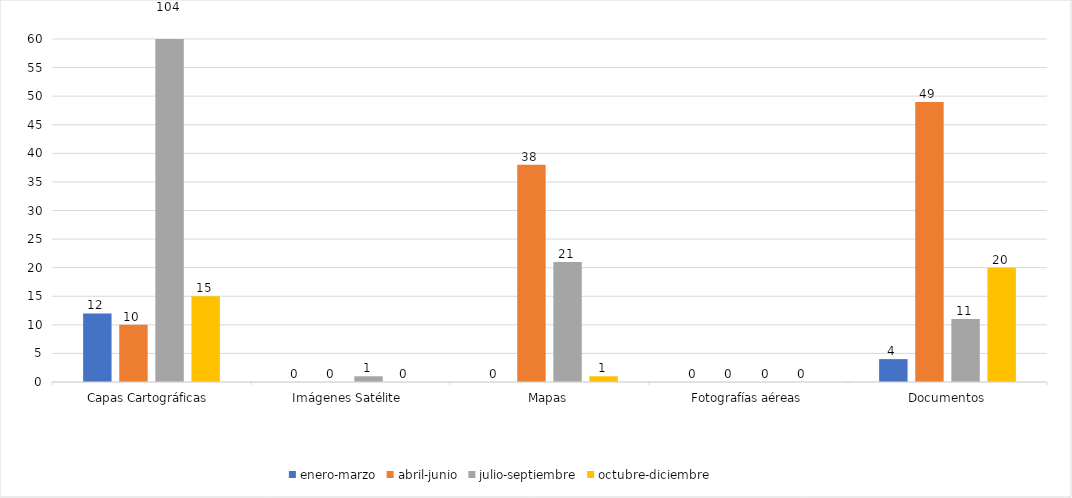
| Category | enero-marzo | abril-junio | julio-septiembre | octubre-diciembre |
|---|---|---|---|---|
| Capas Cartográficas  | 12 | 10 | 104 | 15 |
| Imágenes Satélite  | 0 | 0 | 1 | 0 |
| Mapas | 0 | 38 | 21 | 1 |
| Fotografías aéreas | 0 | 0 | 0 | 0 |
| Documentos | 4 | 49 | 11 | 20 |